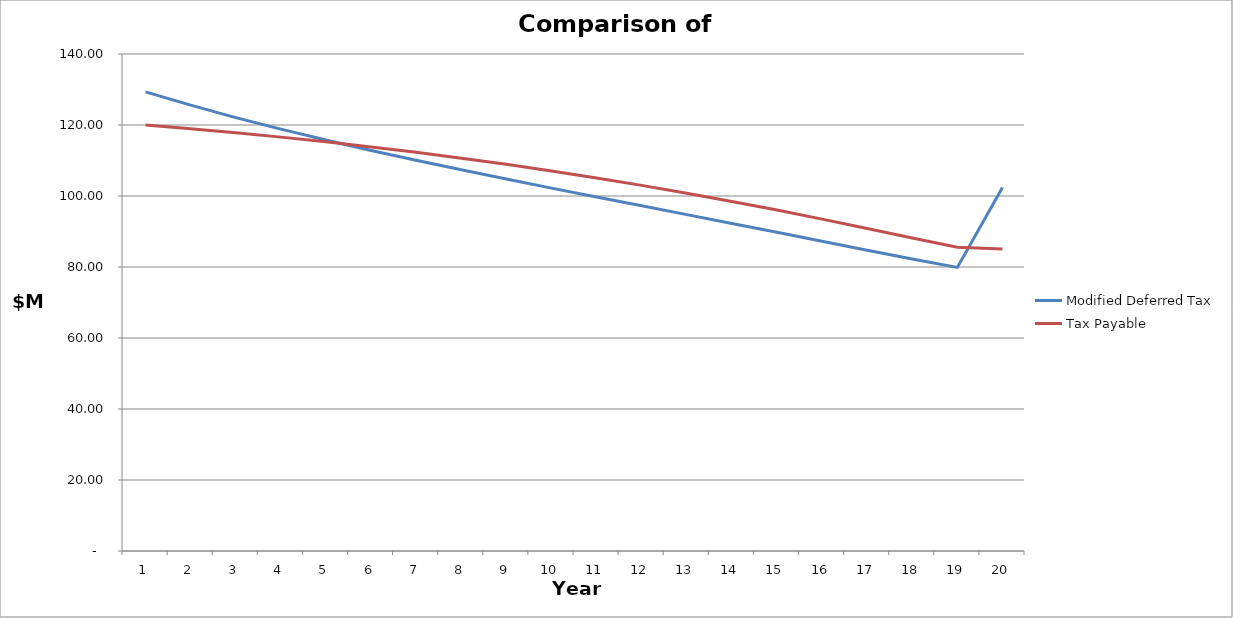
| Category | Modified Deferred Tax | Tax Payable |
|---|---|---|
| 0 | 129.339 | 120 |
| 1 | 125.583 | 118.953 |
| 2 | 122.092 | 117.815 |
| 3 | 118.827 | 116.583 |
| 4 | 115.752 | 115.255 |
| 5 | 112.836 | 113.827 |
| 6 | 110.05 | 112.296 |
| 7 | 107.368 | 110.659 |
| 8 | 104.766 | 108.913 |
| 9 | 102.221 | 107.056 |
| 10 | 99.715 | 105.084 |
| 11 | 97.23 | 102.996 |
| 12 | 94.752 | 100.791 |
| 13 | 92.268 | 98.469 |
| 14 | 89.77 | 96.032 |
| 15 | 87.256 | 93.489 |
| 16 | 84.734 | 90.858 |
| 17 | 82.239 | 88.179 |
| 18 | 79.878 | 85.571 |
| 19 | 102.386 | 85.09 |